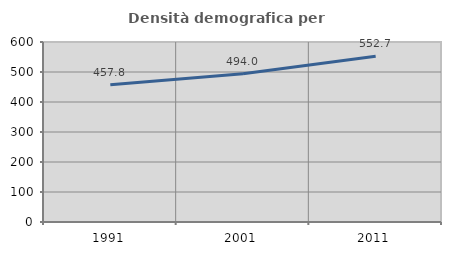
| Category | Densità demografica |
|---|---|
| 1991.0 | 457.818 |
| 2001.0 | 494.039 |
| 2011.0 | 552.736 |